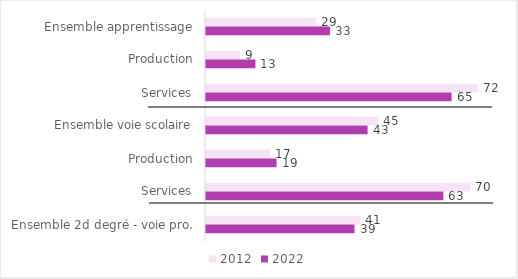
| Category | 2012 | 2022 |
|---|---|---|
| Ensemble apprentissage | 29.093 | 32.757 |
| Production | 8.973 | 13.054 |
| Services | 71.765 | 64.853 |
| Ensemble voie scolaire | 45.49 | 42.675 |
| Production | 16.897 | 18.632 |
| Services | 69.833 | 62.664 |
| Ensemble 2d degré - voie pro. | 40.724 | 39.215 |